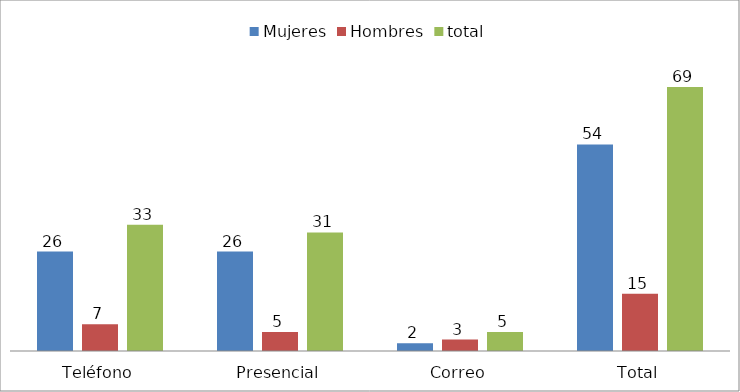
| Category | Mujeres | Hombres | total |
|---|---|---|---|
| Teléfono | 26 | 7 | 33 |
| Presencial | 26 | 5 | 31 |
| Correo | 2 | 3 | 5 |
| Total | 54 | 15 | 69 |